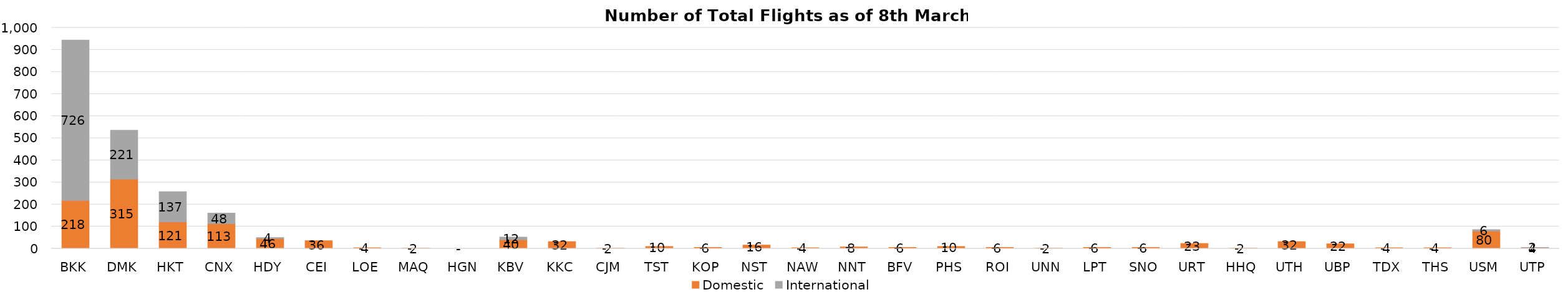
| Category | Domestic | International |
|---|---|---|
| BKK | 218 | 726 |
| DMK | 315 | 221 |
| HKT | 121 | 137 |
| CNX | 113 | 48 |
| HDY | 46 | 4 |
| CEI | 36 | 0 |
| LOE | 4 | 0 |
| MAQ | 2 | 0 |
| HGN | 0 | 0 |
| KBV | 40 | 12 |
| KKC | 32 | 0 |
| CJM | 2 | 0 |
| TST | 10 | 0 |
| KOP | 6 | 0 |
| NST | 16 | 0 |
| NAW | 4 | 0 |
| NNT | 8 | 0 |
| BFV | 6 | 0 |
| PHS | 10 | 0 |
| ROI | 6 | 0 |
| UNN | 2 | 0 |
| LPT | 6 | 0 |
| SNO | 6 | 0 |
| URT | 23 | 0 |
| HHQ | 2 | 0 |
| UTH | 32 | 0 |
| UBP | 22 | 0 |
| TDX | 4 | 0 |
| THS | 4 | 0 |
| USM | 80 | 6 |
| UTP | 4 | 2 |